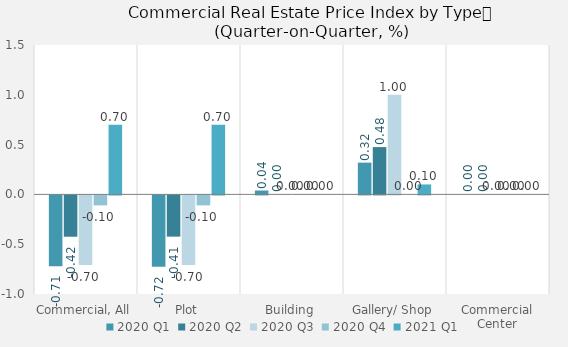
| Category | 2020 | 2021 |
|---|---|---|
| Commercial, All | -0.1 | 0.7 |
| Plot | -0.1 | 0.7 |
| Building | 0 | 0 |
| Gallery/ Shop | 0 | 0.1 |
| Commercial Center | 0 | 0 |